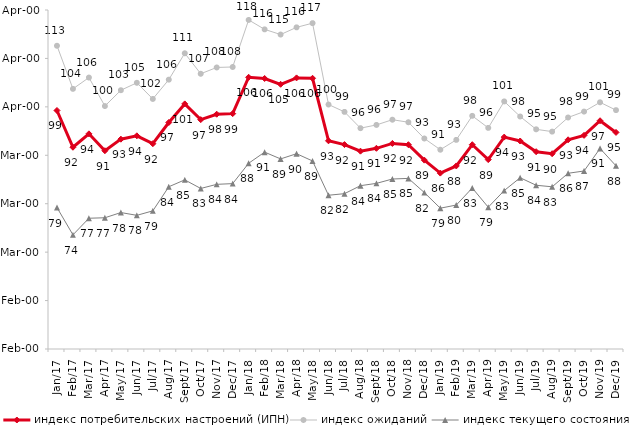
| Category | индекс потребительских настроений (ИПН) | Series 0 | индекс ожиданий | Series 3 | индекс текущего состояния |
|---|---|---|---|---|---|
| 2017-01-01 | 99.25 | 2017-01-01 | 112.617 | 2017-01-01 | 79.2 |
| 2017-02-01 | 91.66 | 2017-02-01 | 103.717 | 2017-02-01 | 73.575 |
| 2017-03-01 | 94.43 | 2017-03-01 | 106.05 | 2017-03-01 | 77 |
| 2017-04-01 | 90.94 | 2017-04-01 | 100.167 | 2017-04-01 | 77.1 |
| 2017-05-01 | 93.33 | 2017-05-01 | 103.433 | 2017-05-01 | 78.175 |
| 2017-06-01 | 94.02 | 2017-06-01 | 104.967 | 2017-06-01 | 77.6 |
| 2017-07-01 | 92.39 | 2017-07-01 | 101.633 | 2017-07-01 | 78.525 |
| 2017-08-01 | 96.77 | 2017-08-01 | 105.617 | 2017-08-01 | 83.5 |
| 2017-09-01 | 100.61 | 2017-09-01 | 111.067 | 2017-09-01 | 84.925 |
| 2017-10-01 | 97.36 | 2017-10-01 | 106.833 | 2017-10-01 | 83.15 |
| 2017-11-01 | 98.48 | 2017-11-01 | 108.133 | 2017-11-01 | 84 |
| 2017-12-01 | 98.6 | 2017-12-01 | 108.233 | 2017-12-01 | 84.15 |
| 2018-01-01 | 106.11 | 2018-01-01 | 117.95 | 2018-01-01 | 88.35 |
| 2018-02-01 | 105.86 | 2018-02-01 | 116 | 2018-02-01 | 90.65 |
| 2018-03-01 | 104.66 | 2018-03-01 | 114.933 | 2018-03-01 | 89.25 |
| 2018-04-01 | 105.98 | 2018-04-01 | 116.417 | 2018-04-01 | 90.325 |
| 2018-05-01 | 105.9 | 2018-05-01 | 117.283 | 2018-05-01 | 88.825 |
| 2018-06-01 | 92.99 | 2018-06-01 | 100.483 | 2018-06-01 | 81.75 |
| 2018-07-01 | 92.21 | 2018-07-01 | 98.967 | 2018-07-01 | 82.075 |
| 2018-08-01 | 90.85 | 2018-08-01 | 95.6 | 2018-08-01 | 83.725 |
| 2018-09-01 | 91.44 | 2018-09-01 | 96.267 | 2018-09-01 | 84.2 |
| 2018-10-01 | 92.45 | 2018-10-01 | 97.35 | 2018-10-01 | 85.1 |
| 2018-11-01 | 92.186 | 2018-11-01 | 96.823 | 2018-11-01 | 85.23 |
| 2018-12-01 | 89 | 2018-12-01 | 93.467 | 2018-12-01 | 82.3 |
| 2019-01-01 | 86.32 | 2019-01-01 | 91.15 | 2019-01-01 | 79.075 |
| 2019-02-01 | 87.8 | 2019-02-01 | 93.183 | 2019-02-01 | 79.725 |
| 2019-03-01 | 92.183 | 2019-03-01 | 98.144 | 2019-03-01 | 83.242 |
| 2019-04-01 | 89.109 | 2019-04-01 | 95.66 | 2019-04-01 | 79.282 |
| 2019-05-01 | 93.759 | 2019-05-01 | 101.123 | 2019-05-01 | 82.714 |
| 2019-06-01 | 92.948 | 2019-06-01 | 98.005 | 2019-06-01 | 85.362 |
| 2019-07-01 | 90.743 | 2019-07-01 | 95.363 | 2019-07-01 | 83.812 |
| 2019-08-01 | 90.33 | 2019-08-01 | 94.888 | 2019-08-01 | 83.492 |
| 2019-09-01 | 93.198 | 2019-09-01 | 97.805 | 2019-09-01 | 86.287 |
| 2019-10-01 | 94.119 | 2019-10-01 | 99.026 | 2019-10-01 | 86.757 |
| 2019-11-01 | 97.129 | 2019-11-01 | 100.941 | 2019-11-01 | 91.411 |
| 2019-12-01 | 94.723 | 2019-12-01 | 99.323 | 2019-12-01 | 87.822 |